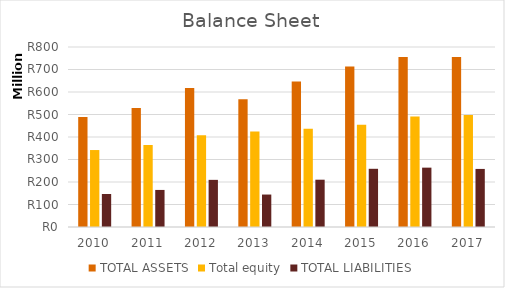
| Category | TOTAL ASSETS | Total equity | TOTAL LIABILITIES |
|---|---|---|---|
| 2010.0 | 488742855 | 342056354 | 146686501 |
| 2011.0 | 529215465 | 364482151 | 164733314 |
| 2012.0 | 617419725 | 407919449 | 209500276 |
| 2013.0 | 568239806 | 423993539 | 144246267 |
| 2014.0 | 646781740 | 436576633 | 210205107 |
| 2015.0 | 712867210 | 454186340 | 258677870 |
| 2016.0 | 755453563 | 491645619 | 263807944 |
| 2017.0 | 755770106 | 497663468 | 258106638 |